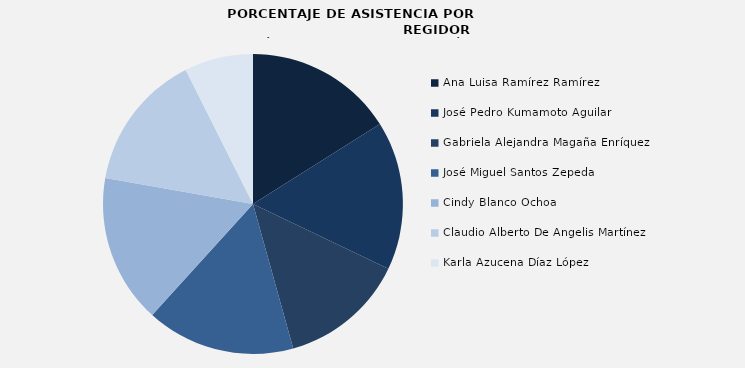
| Category | Ana Luisa Ramírez Ramírez |
|---|---|
| Ana Luisa Ramírez Ramírez | 100 |
| José Pedro Kumamoto Aguilar | 100 |
| Gabriela Alejandra Magaña Enríquez | 84.615 |
| José Miguel Santos Zepeda | 100 |
| Cindy Blanco Ochoa | 100 |
| Claudio Alberto De Angelis Martínez | 92.308 |
| Karla Azucena Díaz López | 46.154 |